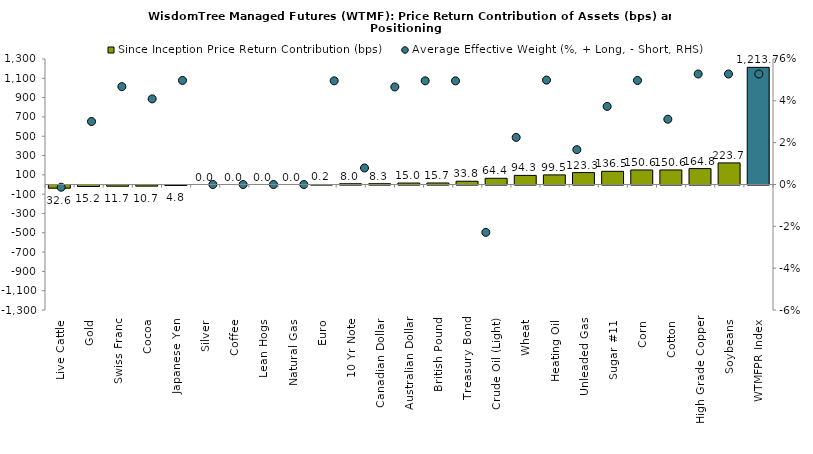
| Category | Since Inception Price Return Contribution (bps) |
|---|---|
| Live Cattle | -32.622 |
| Gold | -15.233 |
| Swiss Franc | -11.683 |
| Cocoa | -10.744 |
| Japanese Yen | -4.805 |
| Silver | 0 |
| Coffee | 0 |
| Lean Hogs | 0 |
| Natural Gas | 0 |
| Euro | 0.157 |
| 10 Yr Note | 7.981 |
| Canadian Dollar | 8.332 |
| Australian Dollar | 15.025 |
| British Pound | 15.743 |
| Treasury Bond | 33.776 |
| Crude Oil (Light) | 64.368 |
| Wheat | 94.348 |
| Heating Oil | 99.487 |
| Unleaded Gas | 123.343 |
| Sugar #11 | 136.541 |
| Corn | 150.553 |
| Cotton | 150.634 |
| High Grade Copper | 164.797 |
| Soybeans | 223.667 |
| WTMFPR Index | 1213.668 |